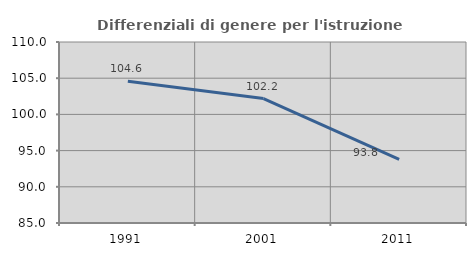
| Category | Differenziali di genere per l'istruzione superiore |
|---|---|
| 1991.0 | 104.569 |
| 2001.0 | 102.191 |
| 2011.0 | 93.788 |